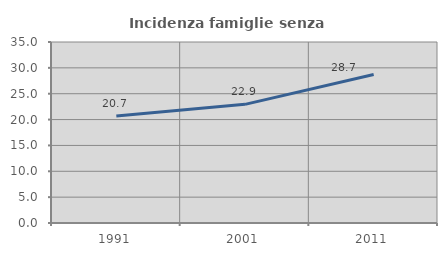
| Category | Incidenza famiglie senza nuclei |
|---|---|
| 1991.0 | 20.677 |
| 2001.0 | 22.941 |
| 2011.0 | 28.705 |